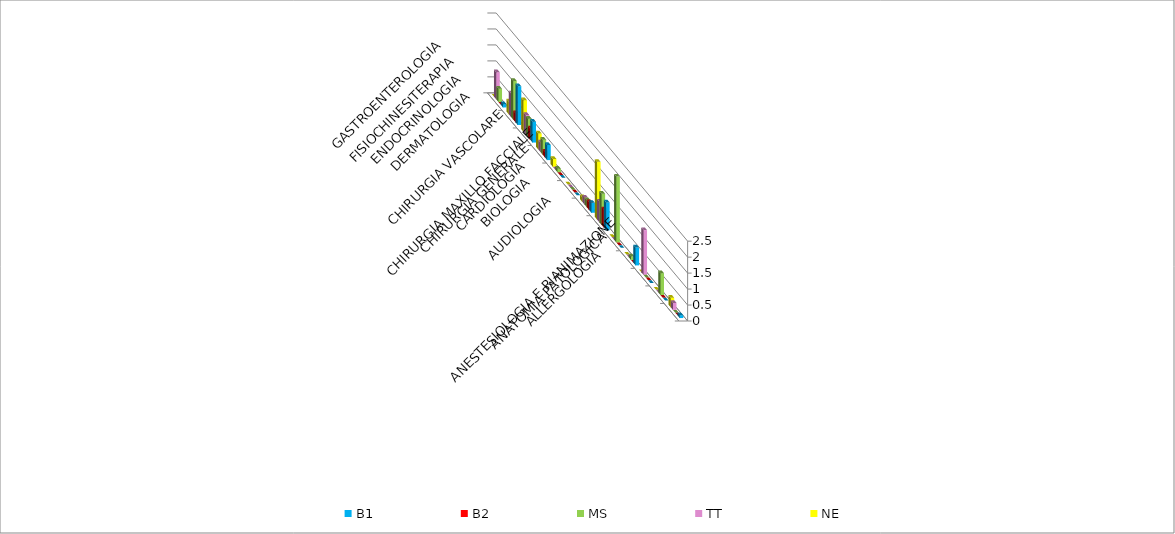
| Category | B1 | B2 | MS | TT | NE |
|---|---|---|---|---|---|
| ALLERGOLOGIA | 0.089 | 0 | 0 | 0.221 | 0.297 |
| ANATOMIA PATOLOGICA | 0 | 0 | 0.687 | 0 | 0 |
| ANESTESIOLOGIA E RIANIMAZIONE | 0 | 0 | 0 | 1.402 | 0 |
| AUDIOLOGIA | 0.562 | 0 | 0.109 | 0 | 0 |
| BIOLOGIA | 0 | 0 | 2.062 | 0 | 0 |
| CARDIOLOGIA | 0.872 | 0.566 | 0.977 | 0.646 | 1.806 |
| CHIRURGIA GENERALE | 0.31 | 0.248 | 0.226 | 0.221 | 0.148 |
| CHIRURGIA MAXILLO FACCIALE | 0 | 0 | 0 | 0 | 0 |
| CHIRURGIA VASCOLARE | 0 | 0 | 0.109 | 0 | 0.247 |
| DERMATOLOGIA | 0.473 | 0.177 | 0.47 | 0.295 | 0.495 |
| ENDOCRINOLOGIA | 0.651 | 0.354 | 0.579 | 0.609 | 0.99 |
| FISIOCHINESITERAPIA | 1.212 | 0.283 | 1.212 | 0.738 | 0.396 |
| GASTROENTEROLOGIA | 0.103 | 0 | 0.416 | 0.849 | 0 |